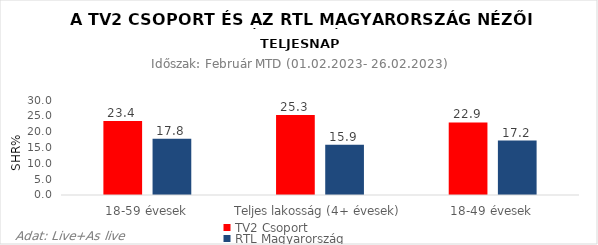
| Category | TV2 Csoport | RTL Magyarország |
|---|---|---|
| 18-59 évesek | 23.4 | 17.8 |
| Teljes lakosság (4+ évesek) | 25.3 | 15.9 |
| 18-49 évesek | 22.9 | 17.2 |